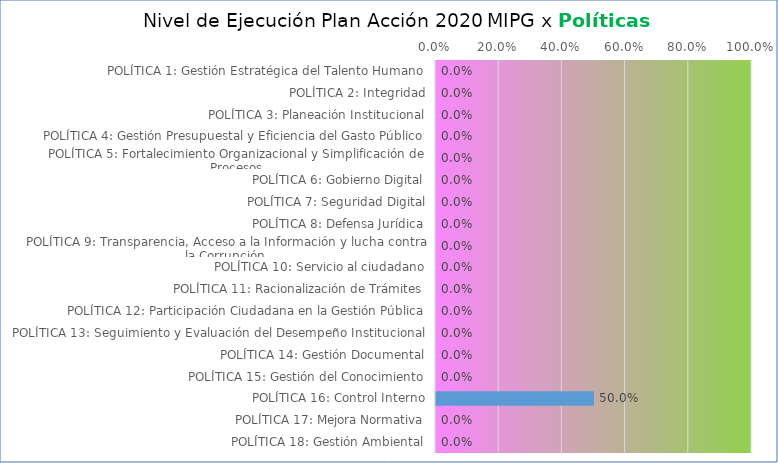
| Category | Series 0 |
|---|---|
| POLÍTICA 1: Gestión Estratégica del Talento Humano | 0 |
| POLÍTICA 2: Integridad | 0 |
| POLÍTICA 3: Planeación Institucional | 0 |
| POLÍTICA 4: Gestión Presupuestal y Eficiencia del Gasto Público | 0 |
| POLÍTICA 5: Fortalecimiento Organizacional y Simplificación de Procesos | 0 |
| POLÍTICA 6: Gobierno Digital | 0 |
| POLÍTICA 7: Seguridad Digital | 0 |
| POLÍTICA 8: Defensa Jurídica | 0 |
| POLÍTICA 9: Transparencia, Acceso a la Información y lucha contra la Corrupción | 0 |
| POLÍTICA 10: Servicio al ciudadano | 0 |
| POLÍTICA 11: Racionalización de Trámites | 0 |
| POLÍTICA 12: Participación Ciudadana en la Gestión Pública | 0 |
| POLÍTICA 13: Seguimiento y Evaluación del Desempeño Institucional | 0 |
| POLÍTICA 14: Gestión Documental | 0 |
| POLÍTICA 15: Gestión del Conocimiento | 0 |
| POLÍTICA 16: Control Interno | 0.5 |
| POLÍTICA 17: Mejora Normativa | 0 |
| POLÍTICA 18: Gestión Ambiental | 0 |